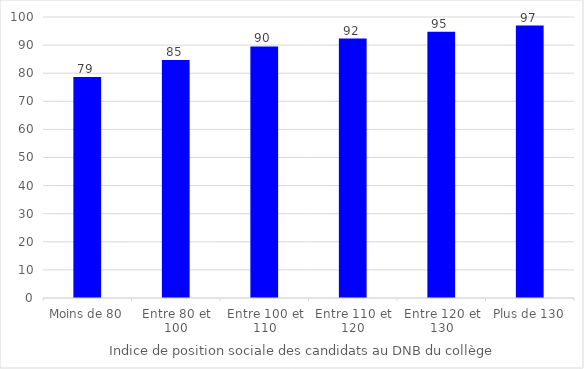
| Category | Taux de réussite (en %) |
|---|---|
| Moins de 80 | 78.654 |
| Entre 80 et 100 | 84.707 |
| Entre 100 et 110 | 89.546 |
| Entre 110 et 120 | 92.305 |
| Entre 120 et 130 | 94.755 |
| Plus de 130 | 96.952 |